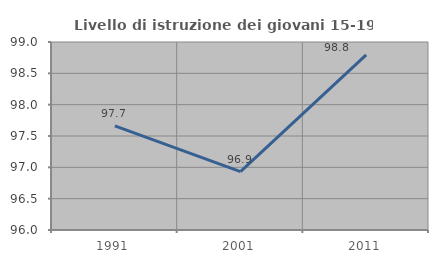
| Category | Livello di istruzione dei giovani 15-19 anni |
|---|---|
| 1991.0 | 97.661 |
| 2001.0 | 96.933 |
| 2011.0 | 98.795 |